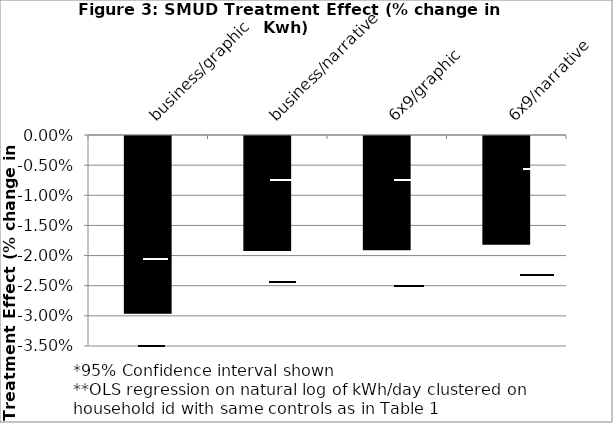
| Category | Series 0 |
|---|---|
| business/graphic | -0.029 |
| business/narrative | -0.019 |
| 6x9/graphic | -0.019 |
| 6x9/narrative | -0.018 |